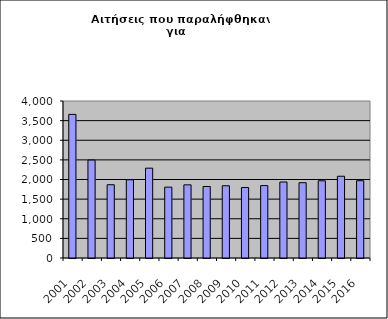
| Category | Series 1 |
|---|---|
| 2001.0 | 3659 |
| 2002.0 | 2495 |
| 2003.0 | 1867 |
| 2004.0 | 1993 |
| 2005.0 | 2289 |
| 2006.0 | 1805 |
| 2007.0 | 1864 |
| 2008.0 | 1822 |
| 2009.0 | 1840 |
| 2010.0 | 1795 |
| 2011.0 | 1844 |
| 2012.0 | 1936 |
| 2013.0 | 1918 |
| 2014.0 | 1967 |
| 2015.0 | 2083 |
| 2016.0 | 1969 |